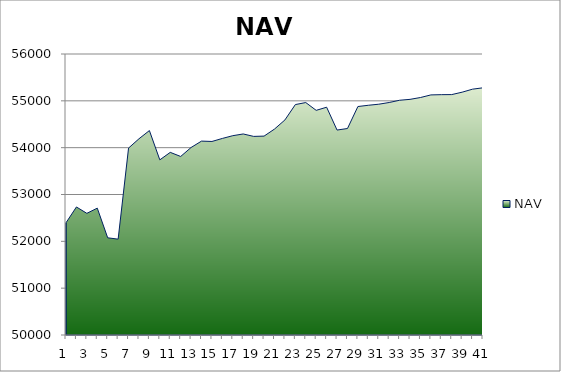
| Category | NAV |
|---|---|
| 0 | 52397 |
| 1 | 52733.957 |
| 2 | 52597.875 |
| 3 | 52708.772 |
| 4 | 52075.184 |
| 5 | 52046.775 |
| 6 | 53991.219 |
| 7 | 54189.909 |
| 8 | 54364.909 |
| 9 | 53739.909 |
| 10 | 53899.542 |
| 11 | 53812.294 |
| 12 | 54003.961 |
| 13 | 54140.037 |
| 14 | 54132.37 |
| 15 | 54197.37 |
| 16 | 54255.812 |
| 17 | 54292.622 |
| 18 | 54240.699 |
| 19 | 54246.834 |
| 20 | 54397.391 |
| 21 | 54592.197 |
| 22 | 54920.119 |
| 23 | 54963.245 |
| 24 | 54796.799 |
| 25 | 54863.963 |
| 26 | 54375.975 |
| 27 | 54409.015 |
| 28 | 54878.402 |
| 29 | 54905.151 |
| 30 | 54927.958 |
| 31 | 54964.157 |
| 32 | 55012.385 |
| 33 | 55031.616 |
| 34 | 55070.791 |
| 35 | 55126.461 |
| 36 | 55131.71 |
| 37 | 55133.391 |
| 38 | 55184.783 |
| 39 | 55249.119 |
| 40 | 55278.196 |